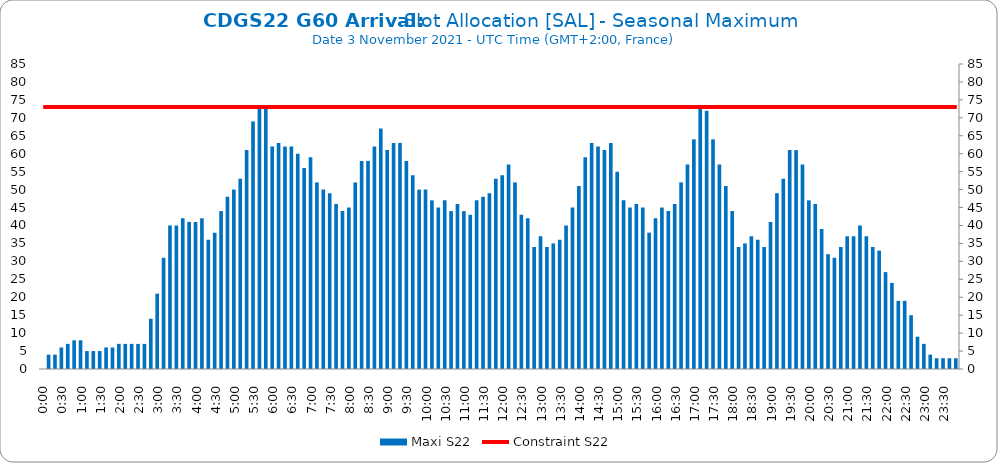
| Category | Maxi S22 |
|---|---|
| 0.0 | 0 |
| 0.006944444444444444 | 4 |
| 0.013888888888888888 | 4 |
| 0.020833333333333332 | 6 |
| 0.027777777777777776 | 7 |
| 0.034722222222222224 | 8 |
| 0.041666666666666664 | 8 |
| 0.04861111111111111 | 5 |
| 0.05555555555555555 | 5 |
| 0.0625 | 5 |
| 0.06944444444444443 | 6 |
| 0.0763888888888889 | 6 |
| 0.08333333333333333 | 7 |
| 0.09027777777777778 | 7 |
| 0.09722222222222222 | 7 |
| 0.10416666666666667 | 7 |
| 0.1111111111111111 | 7 |
| 0.11805555555555557 | 14 |
| 0.125 | 21 |
| 0.13194444444444445 | 31 |
| 0.1388888888888889 | 40 |
| 0.14583333333333334 | 40 |
| 0.15277777777777776 | 42 |
| 0.15972222222222224 | 41 |
| 0.16666666666666666 | 41 |
| 0.17361111111111113 | 42 |
| 0.18055555555555555 | 36 |
| 0.1875 | 38 |
| 0.19444444444444445 | 44 |
| 0.20138888888888887 | 48 |
| 0.20833333333333334 | 50 |
| 0.2152777777777778 | 53 |
| 0.2222222222222222 | 61 |
| 0.22916666666666666 | 69 |
| 0.23611111111111113 | 73 |
| 0.24305555555555555 | 73 |
| 0.25 | 62 |
| 0.2569444444444445 | 63 |
| 0.2638888888888889 | 62 |
| 0.2708333333333333 | 62 |
| 0.2777777777777778 | 60 |
| 0.2847222222222222 | 56 |
| 0.2916666666666667 | 59 |
| 0.2986111111111111 | 52 |
| 0.3055555555555555 | 50 |
| 0.3125 | 49 |
| 0.3194444444444445 | 46 |
| 0.3263888888888889 | 44 |
| 0.3333333333333333 | 45 |
| 0.34027777777777773 | 52 |
| 0.34722222222222227 | 58 |
| 0.3541666666666667 | 58 |
| 0.3611111111111111 | 62 |
| 0.3680555555555556 | 67 |
| 0.375 | 61 |
| 0.3819444444444444 | 63 |
| 0.3888888888888889 | 63 |
| 0.3958333333333333 | 58 |
| 0.40277777777777773 | 54 |
| 0.40972222222222227 | 50 |
| 0.4166666666666667 | 50 |
| 0.4236111111111111 | 47 |
| 0.4305555555555556 | 45 |
| 0.4375 | 47 |
| 0.4444444444444444 | 44 |
| 0.4513888888888889 | 46 |
| 0.4583333333333333 | 44 |
| 0.46527777777777773 | 43 |
| 0.47222222222222227 | 47 |
| 0.4791666666666667 | 48 |
| 0.4861111111111111 | 49 |
| 0.4930555555555556 | 53 |
| 0.5 | 54 |
| 0.5069444444444444 | 57 |
| 0.513888888888889 | 52 |
| 0.5208333333333334 | 43 |
| 0.5277777777777778 | 42 |
| 0.5347222222222222 | 34 |
| 0.5416666666666666 | 37 |
| 0.548611111111111 | 34 |
| 0.5555555555555556 | 35 |
| 0.5625 | 36 |
| 0.5694444444444444 | 40 |
| 0.576388888888889 | 45 |
| 0.5833333333333334 | 51 |
| 0.5902777777777778 | 59 |
| 0.5972222222222222 | 63 |
| 0.6041666666666666 | 62 |
| 0.611111111111111 | 61 |
| 0.6180555555555556 | 63 |
| 0.625 | 55 |
| 0.6319444444444444 | 47 |
| 0.638888888888889 | 45 |
| 0.6458333333333334 | 46 |
| 0.6527777777777778 | 45 |
| 0.6597222222222222 | 38 |
| 0.6666666666666666 | 42 |
| 0.6736111111111112 | 45 |
| 0.6805555555555555 | 44 |
| 0.6875 | 46 |
| 0.6944444444444445 | 52 |
| 0.7013888888888888 | 57 |
| 0.7083333333333334 | 64 |
| 0.7152777777777778 | 73 |
| 0.7222222222222222 | 72 |
| 0.7291666666666666 | 64 |
| 0.7361111111111112 | 57 |
| 0.7430555555555555 | 51 |
| 0.75 | 44 |
| 0.7569444444444445 | 34 |
| 0.7638888888888888 | 35 |
| 0.7708333333333334 | 37 |
| 0.7777777777777778 | 36 |
| 0.7847222222222222 | 34 |
| 0.7916666666666666 | 41 |
| 0.7986111111111112 | 49 |
| 0.8055555555555555 | 53 |
| 0.8125 | 61 |
| 0.8194444444444445 | 61 |
| 0.8263888888888888 | 57 |
| 0.8333333333333334 | 47 |
| 0.8402777777777778 | 46 |
| 0.8472222222222222 | 39 |
| 0.8541666666666666 | 32 |
| 0.8611111111111112 | 31 |
| 0.8680555555555555 | 34 |
| 0.875 | 37 |
| 0.8819444444444445 | 37 |
| 0.8888888888888888 | 40 |
| 0.8958333333333334 | 37 |
| 0.9027777777777778 | 34 |
| 0.9097222222222222 | 33 |
| 0.9166666666666666 | 27 |
| 0.9236111111111112 | 24 |
| 0.9305555555555555 | 19 |
| 0.9375 | 19 |
| 0.9444444444444445 | 15 |
| 0.9513888888888888 | 9 |
| 0.9583333333333334 | 7 |
| 0.9652777777777778 | 4 |
| 0.9722222222222222 | 3 |
| 0.9791666666666666 | 3 |
| 0.9861111111111112 | 3 |
| 0.9930555555555555 | 3 |